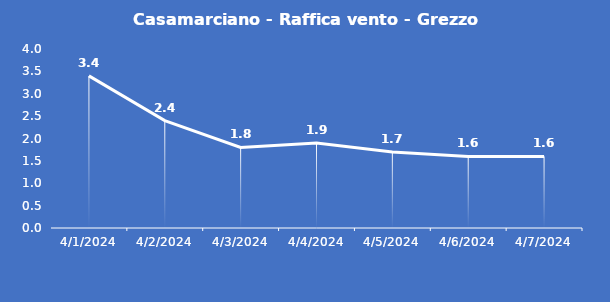
| Category | Casamarciano - Raffica vento - Grezzo (m/s) |
|---|---|
| 4/1/24 | 3.4 |
| 4/2/24 | 2.4 |
| 4/3/24 | 1.8 |
| 4/4/24 | 1.9 |
| 4/5/24 | 1.7 |
| 4/6/24 | 1.6 |
| 4/7/24 | 1.6 |